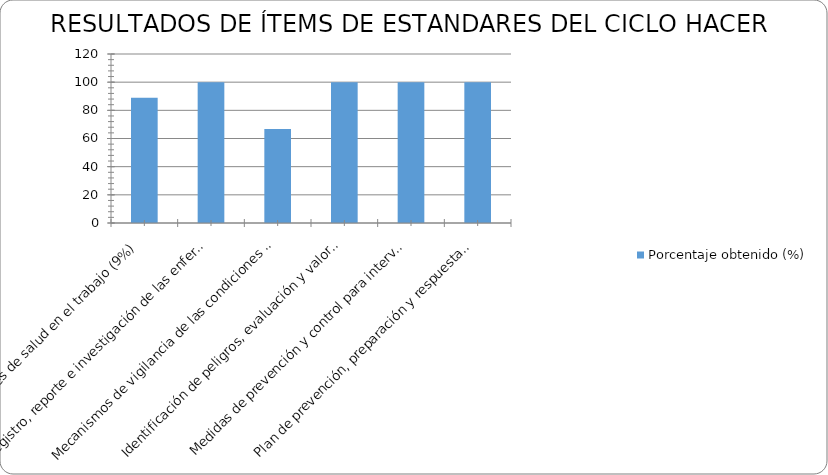
| Category | Porcentaje obtenido (%) |
|---|---|
| Condiciones de salud en el trabajo (9%) | 88.89 |
| Registro, reporte e investigación de las enfermedades laborales, los incidentes y accidentes del trabajo (5%) | 100 |
| Mecanismos de vigilancia de las condiciones de salud de los trabajadores (6%) | 66.67 |
| Identificación de peligros, evaluación y valoración de los riesgos (15%) | 100 |
| Medidas de prevención y control para intervenir los peligros /riesgos (15%) | 100 |
| Plan de prevención, preparación y respuesta ante emergencias (10%) | 100 |